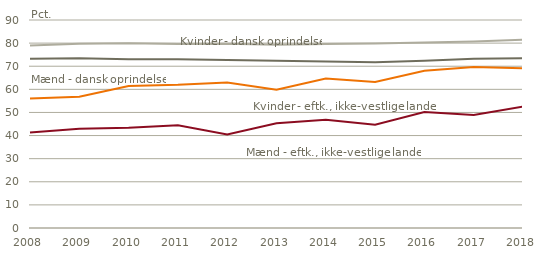
| Category | Mænd - dansk oprindelse | Kvinder - dansk oprindelse | Mænd - eftk., ikke-vestlige lande | Kvinder - eftk., ikke-vestlige lande |
|---|---|---|---|---|
| 2008.0 | 73.249 | 78.922 | 41.294 | 56.053 |
| 2009.0 | 73.428 | 79.719 | 42.984 | 56.78 |
| 2010.0 | 72.966 | 79.949 | 43.414 | 61.458 |
| 2011.0 | 73.018 | 79.637 | 44.424 | 61.939 |
| 2012.0 | 72.697 | 79.755 | 40.48 | 62.929 |
| 2013.0 | 72.38 | 79.296 | 45.333 | 59.848 |
| 2014.0 | 72.066 | 79.572 | 46.84 | 64.73 |
| 2015.0 | 71.735 | 79.807 | 44.64 | 63.225 |
| 2016.0 | 72.315 | 80.307 | 50.153 | 68.062 |
| 2017.0 | 73.217 | 80.68 | 48.917 | 69.654 |
| 2018.0 | 73.498 | 81.487 | 52.558 | 69.078 |